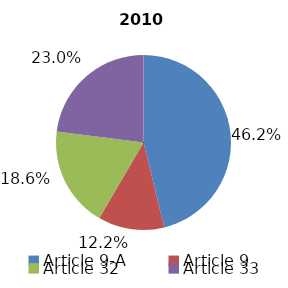
| Category | 2010 |
|---|---|
| Article 9-A | 2220629339 |
| Article 9 | 588820491 |
| Article 32 | 892808165 |
| Article 33 | 1106486382 |